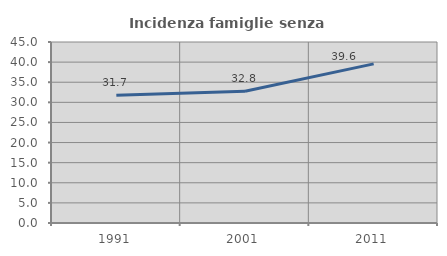
| Category | Incidenza famiglie senza nuclei |
|---|---|
| 1991.0 | 31.746 |
| 2001.0 | 32.765 |
| 2011.0 | 39.567 |